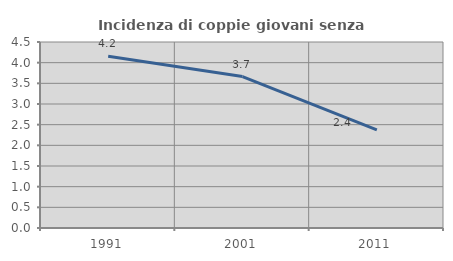
| Category | Incidenza di coppie giovani senza figli |
|---|---|
| 1991.0 | 4.153 |
| 2001.0 | 3.665 |
| 2011.0 | 2.373 |